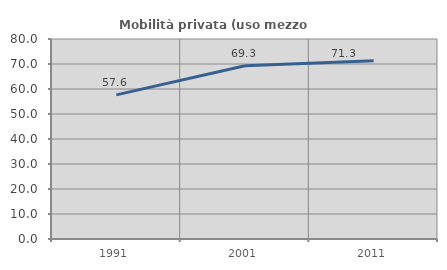
| Category | Mobilità privata (uso mezzo privato) |
|---|---|
| 1991.0 | 57.648 |
| 2001.0 | 69.314 |
| 2011.0 | 71.267 |